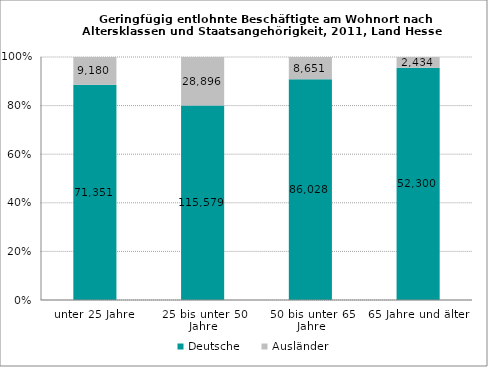
| Category | Deutsche | Ausländer |
|---|---|---|
| unter 25 Jahre | 71351 | 9180 |
| 25 bis unter 50 Jahre | 115579 | 28896 |
| 50 bis unter 65 Jahre | 86028 | 8651 |
| 65 Jahre und älter | 52300 | 2434 |